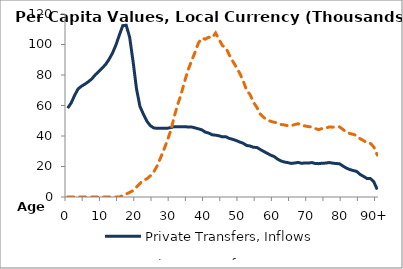
| Category | Private Transfers, Inflows | Private Transfers, Outflows |
|---|---|---|
| 0 | 58275.189 | 0 |
|  | 61639.9 | 0 |
| 2 | 66619.622 | 0 |
| 3 | 70841.164 | 0 |
| 4 | 72655.178 | 0 |
| 5 | 74037.637 | 0 |
| 6 | 75578.374 | 0 |
| 7 | 77437.011 | 0 |
| 8 | 80081.127 | 0 |
| 9 | 82260.114 | 0 |
| 10 | 84545.144 | 0 |
| 11 | 86859.611 | 0 |
| 12 | 90238.988 | 0 |
| 13 | 94269.683 | 0 |
| 14 | 99604.568 | 0 |
| 15 | 106084.814 | 0 |
| 16 | 112374.357 | 909.212 |
| 17 | 112625.469 | 1953.32 |
| 18 | 104862.727 | 3035.003 |
| 19 | 88844.486 | 4141.189 |
| 20 | 70906.339 | 6520.317 |
| 21 | 59374.111 | 8857.681 |
| 22 | 54323.636 | 11175.55 |
| 23 | 49750.682 | 11850.553 |
| 24 | 46821.997 | 13847.147 |
| 25 | 45280.383 | 16389.496 |
| 26 | 45058.461 | 20420.746 |
| 27 | 45005.02 | 25788.481 |
| 28 | 45031.451 | 31265.958 |
| 29 | 45112.312 | 37327.886 |
| 30 | 45547.419 | 43816.644 |
| 31 | 46143.484 | 53054.357 |
| 32 | 46112.457 | 60768.939 |
| 33 | 46009.4 | 67591.933 |
| 34 | 46143.146 | 75924.499 |
| 35 | 45899.494 | 83365.969 |
| 36 | 45919.415 | 89200.014 |
| 37 | 45326.589 | 94857.155 |
| 38 | 44718.167 | 101002.57 |
| 39 | 44023.864 | 104190.006 |
| 40 | 42556.015 | 103472.892 |
| 41 | 41906.22 | 104808.68 |
| 42 | 40780.654 | 104409.248 |
| 43 | 40547.008 | 107520.097 |
| 44 | 40116.99 | 103298.193 |
| 45 | 39421.86 | 99238.861 |
| 46 | 39456.243 | 97847.05 |
| 47 | 38404.665 | 93063.464 |
| 48 | 37790.113 | 88944.639 |
| 49 | 37016.902 | 85194.762 |
| 50 | 36059.611 | 81191.444 |
| 51 | 35260.335 | 76188.201 |
| 52 | 33801.957 | 70092.217 |
| 53 | 33449.91 | 67187.868 |
| 54 | 32598.691 | 62138.228 |
| 55 | 32482.894 | 58752.656 |
| 56 | 31128.615 | 54287.949 |
| 57 | 29858.203 | 52137.941 |
| 58 | 28642.401 | 50545.229 |
| 59 | 27465.356 | 49652.895 |
| 60 | 26536.569 | 49004.976 |
| 61 | 24858.961 | 48665.291 |
| 62 | 23649.745 | 47519.819 |
| 63 | 22923.696 | 47263.366 |
| 64 | 22533.073 | 46709.294 |
| 65 | 22020.079 | 46789.238 |
| 66 | 22293.1 | 47513.227 |
| 67 | 22688.816 | 48059.216 |
| 68 | 22050.063 | 47098.73 |
| 69 | 22358.096 | 46565.519 |
| 70 | 22242.619 | 46154.239 |
| 71 | 22581.212 | 45959.194 |
| 72 | 21940.084 | 44840.204 |
| 73 | 21871.054 | 44184.676 |
| 74 | 22169.837 | 44925.683 |
| 75 | 22225.893 | 45124.859 |
| 76 | 22593.542 | 45946.631 |
| 77 | 22211.735 | 45800.545 |
| 78 | 21946.506 | 45935.802 |
| 79 | 21791.491 | 45998.247 |
| 80 | 20337.319 | 44340.537 |
| 81 | 18959.463 | 42458.058 |
| 82 | 18012.169 | 41669.346 |
| 83 | 17342.163 | 41043.254 |
| 84 | 16776.711 | 40374.954 |
| 85 | 14810.552 | 38185.582 |
| 86 | 13523.082 | 37047.754 |
| 87 | 12140.887 | 35434.192 |
| 88 | 12104.951 | 35140.177 |
| 89 | 9895.93 | 32778.442 |
| 90+ | 4913.412 | 27517.799 |